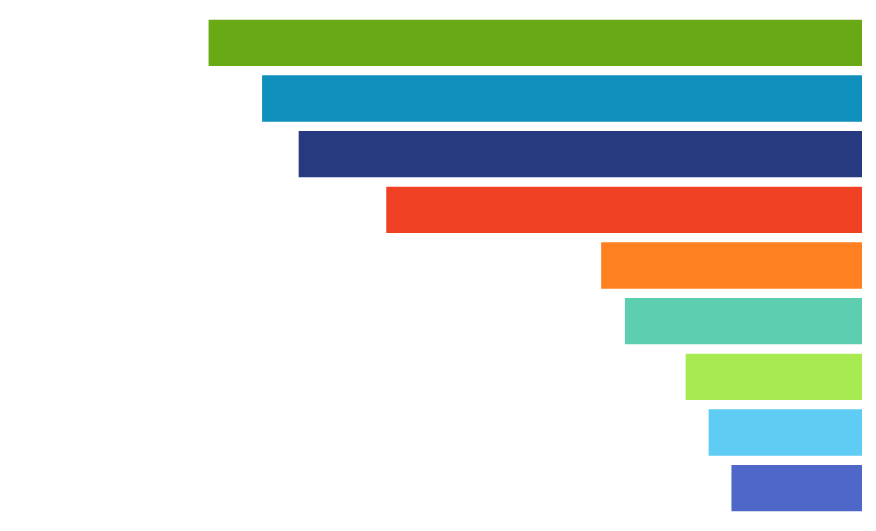
| Category | SALES FORECAST |
|---|---|
| Analysis | -38284 |
| First Contact | -45025 |
| Negotiations | -51821 |
| First Interview | -69758 |
| Final Commitment | -76787 |
| Pre-Approach | -140291 |
| Development | -166174 |
| Follow Up | -176982 |
| Proposed Commitment  | -192792 |